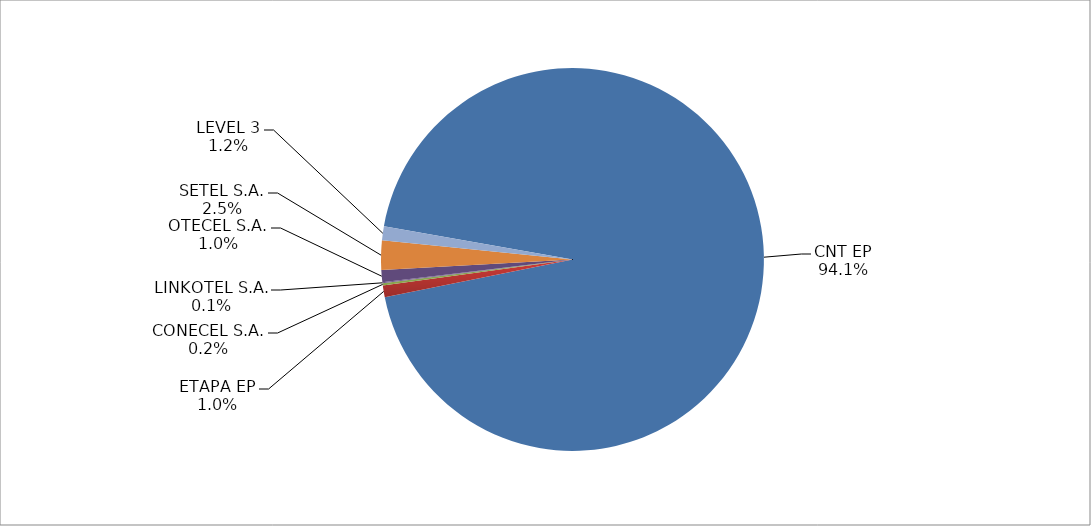
| Category | Series 0 |
|---|---|
| CNT EP | 2471 |
| ETAPA EP | 26 |
| CONECEL S.A. | 5 |
| LINKOTEL S.A. | 2 |
| OTECEL S.A. | 27 |
| SETEL S.A. | 65 |
| LEVEL 3 | 31 |